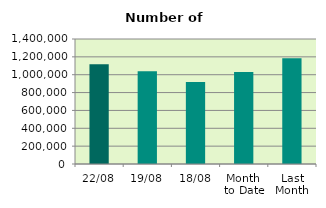
| Category | Series 0 |
|---|---|
| 22/08 | 1118364 |
| 19/08 | 1038726 |
| 18/08 | 917910 |
| Month 
to Date | 1029741.375 |
| Last
Month | 1183989.81 |